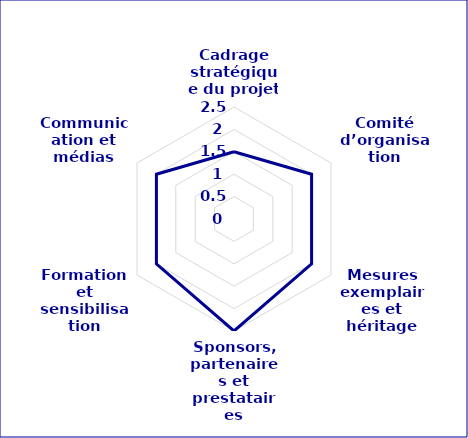
| Category | Series 0 | Series 1 |
|---|---|---|
| Cadrage stratégique du projet  |  | 1.5 |
| Comité d’organisation |  | 2 |
| Mesures exemplaires et héritage |  | 2 |
| Sponsors, partenaires et prestataires |  | 2.5 |
| Formation et sensibilisation |  | 2 |
| Communication et médias |  | 2 |